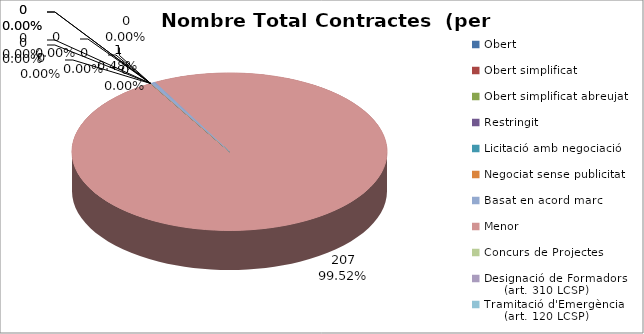
| Category | Nombre Total Contractes |
|---|---|
| Obert | 0 |
| Obert simplificat | 0 |
| Obert simplificat abreujat | 0 |
| Restringit | 0 |
| Licitació amb negociació | 0 |
| Negociat sense publicitat | 0 |
| Basat en acord marc | 1 |
| Menor | 207 |
| Concurs de Projectes | 0 |
| Designació de Formadors
     (art. 310 LCSP) | 0 |
| Tramitació d'Emergència
     (art. 120 LCSP) | 0 |